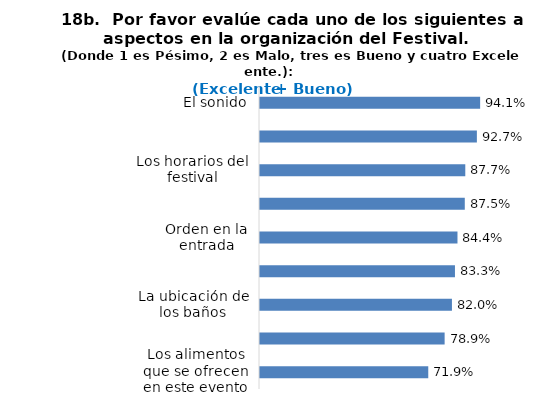
| Category | Series 0 |
|---|---|
| El sonido | 0.941 |
| La iluminación | 0.927 |
| Los horarios del festival | 0.877 |
| El aseo en general al interior del evento | 0.875 |
| Orden en la entrada | 0.844 |
| La seguridad al interior del evento | 0.833 |
| La ubicación de los baños | 0.82 |
| La cantidad de baños | 0.789 |
| Los alimentos que se ofrecen en este evento | 0.719 |